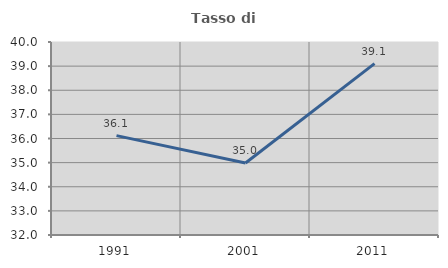
| Category | Tasso di occupazione   |
|---|---|
| 1991.0 | 36.119 |
| 2001.0 | 34.983 |
| 2011.0 | 39.104 |